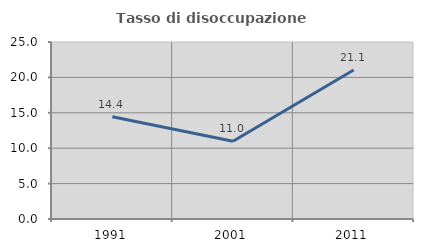
| Category | Tasso di disoccupazione giovanile  |
|---|---|
| 1991.0 | 14.437 |
| 2001.0 | 10.979 |
| 2011.0 | 21.053 |